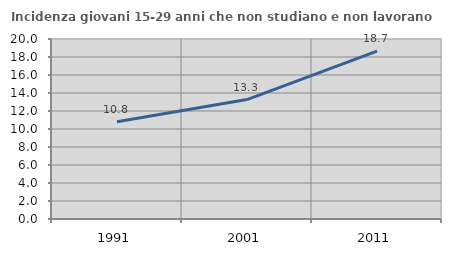
| Category | Incidenza giovani 15-29 anni che non studiano e non lavorano  |
|---|---|
| 1991.0 | 10.795 |
| 2001.0 | 13.27 |
| 2011.0 | 18.66 |